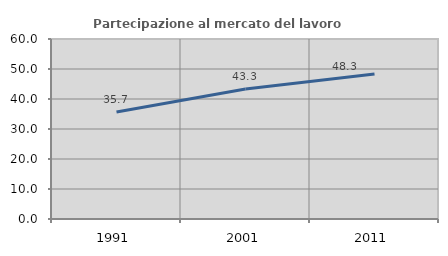
| Category | Partecipazione al mercato del lavoro  femminile |
|---|---|
| 1991.0 | 35.678 |
| 2001.0 | 43.321 |
| 2011.0 | 48.347 |